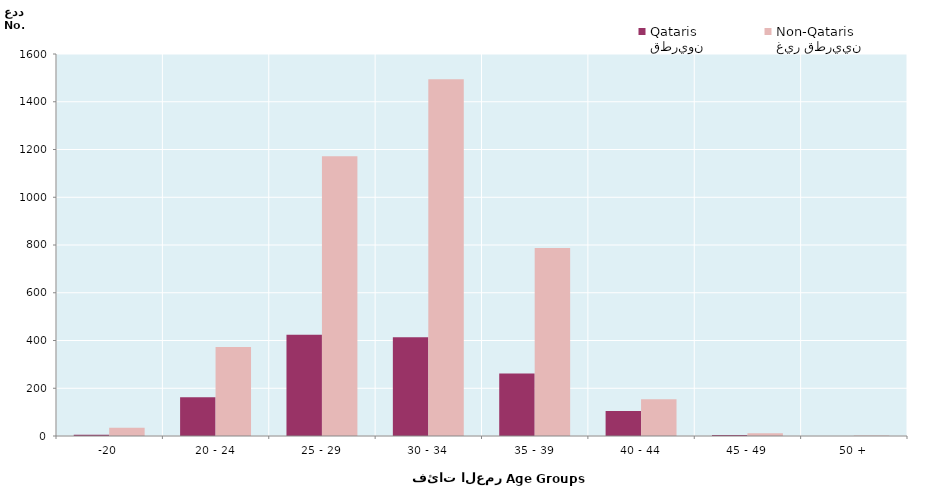
| Category | قطريون
Qataris | غير قطريين
Non-Qataris |
|---|---|---|
| -20 | 5 | 35 |
| 20 - 24 | 162 | 373 |
| 25 - 29 | 424 | 1172 |
| 30 - 34 | 414 | 1494 |
| 35 - 39 | 262 | 787 |
| 40 - 44 | 105 | 154 |
| 45 - 49 | 4 | 11 |
| 50 + | 0 | 2 |